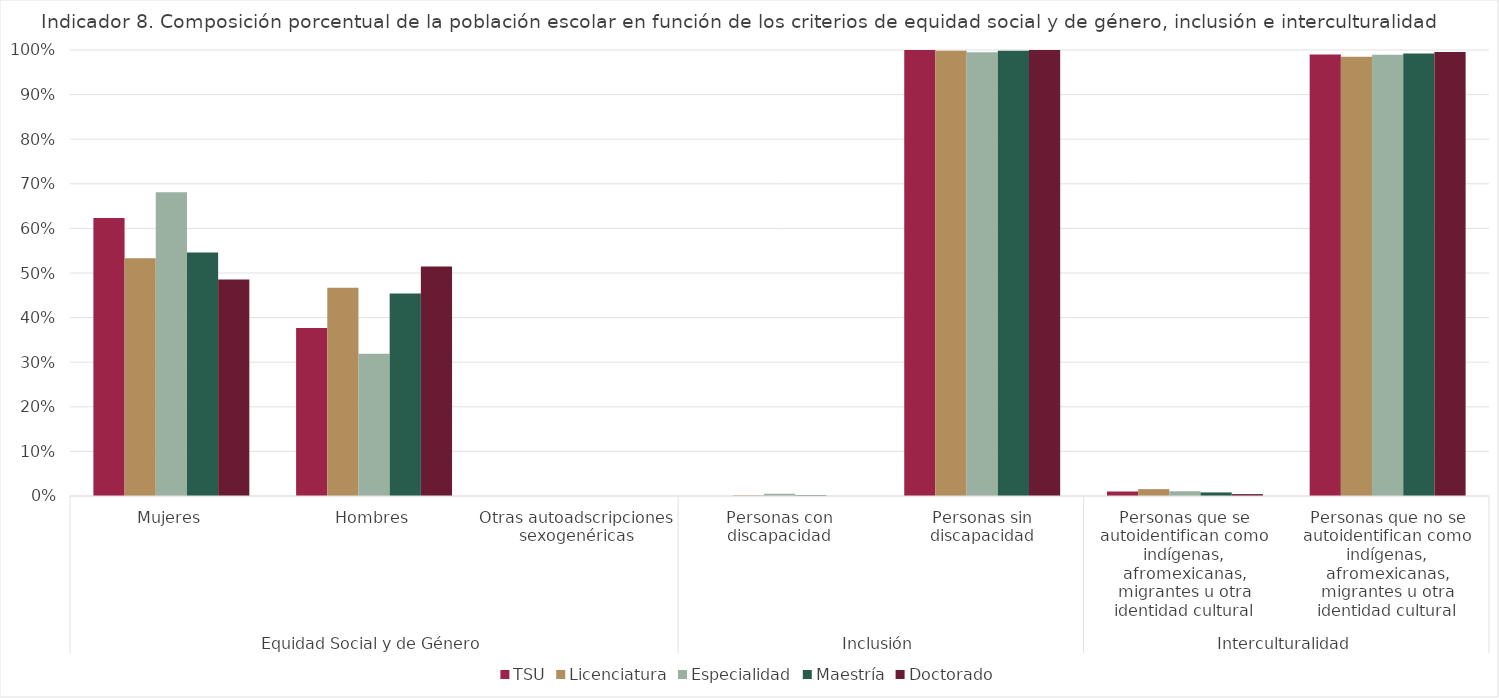
| Category | TSU | Licenciatura | Especialidad | Maestría | Doctorado |
|---|---|---|---|---|---|
| 0 | 0.623 | 0.533 | 0.681 | 0.546 | 0.485 |
| 1 | 0.377 | 0.467 | 0.319 | 0.454 | 0.515 |
| 2 | 0 | 0 | 0 | 0 | 0 |
| 3 | 0 | 0.002 | 0.005 | 0.002 | 0 |
| 4 | 1 | 0.998 | 0.995 | 0.998 | 1 |
| 5 | 0.01 | 0.015 | 0.011 | 0.008 | 0.004 |
| 6 | 0.99 | 0.985 | 0.989 | 0.992 | 0.996 |